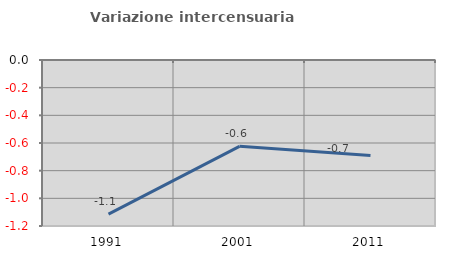
| Category | Variazione intercensuaria annua |
|---|---|
| 1991.0 | -1.114 |
| 2001.0 | -0.624 |
| 2011.0 | -0.69 |